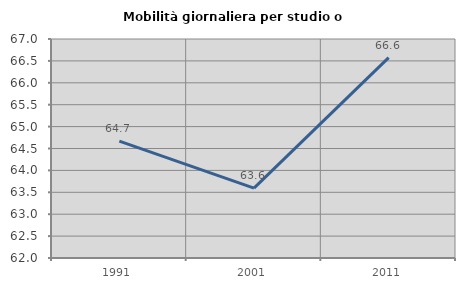
| Category | Mobilità giornaliera per studio o lavoro |
|---|---|
| 1991.0 | 64.669 |
| 2001.0 | 63.597 |
| 2011.0 | 66.576 |